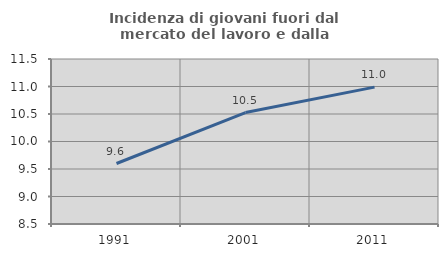
| Category | Incidenza di giovani fuori dal mercato del lavoro e dalla formazione  |
|---|---|
| 1991.0 | 9.6 |
| 2001.0 | 10.526 |
| 2011.0 | 10.989 |